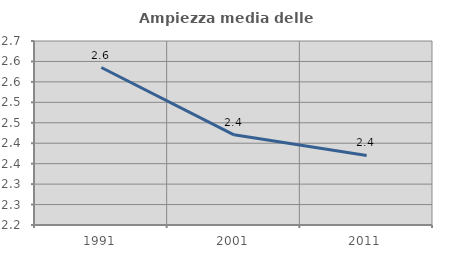
| Category | Ampiezza media delle famiglie |
|---|---|
| 1991.0 | 2.585 |
| 2001.0 | 2.421 |
| 2011.0 | 2.37 |